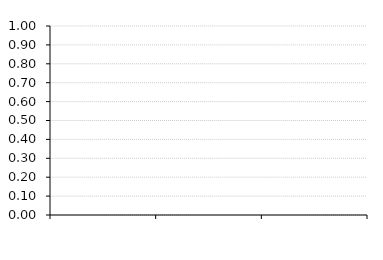
| Category | Avg. Collection Period |
|---|---|
| 0 | 0 |
| 1 | 0 |
| 2 | 0 |